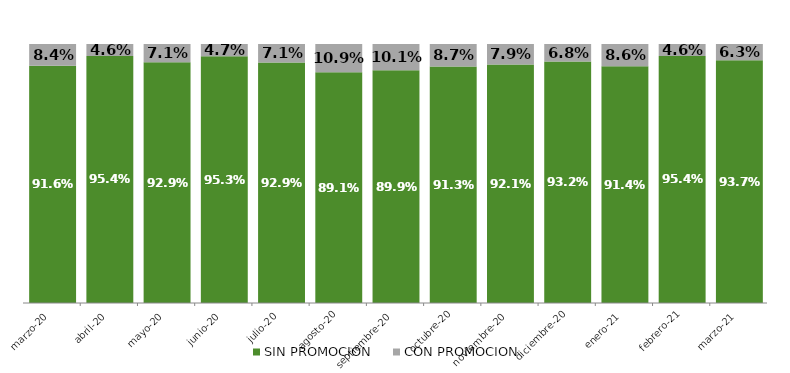
| Category | SIN PROMOCION   | CON PROMOCION   |
|---|---|---|
| 2020-03-01 | 0.916 | 0.084 |
| 2020-04-01 | 0.954 | 0.046 |
| 2020-05-01 | 0.929 | 0.071 |
| 2020-06-01 | 0.953 | 0.047 |
| 2020-07-01 | 0.929 | 0.071 |
| 2020-08-01 | 0.891 | 0.109 |
| 2020-09-01 | 0.899 | 0.101 |
| 2020-10-01 | 0.913 | 0.087 |
| 2020-11-01 | 0.921 | 0.079 |
| 2020-12-01 | 0.932 | 0.068 |
| 2021-01-01 | 0.914 | 0.086 |
| 2021-02-01 | 0.954 | 0.046 |
| 2021-03-01 | 0.937 | 0.063 |